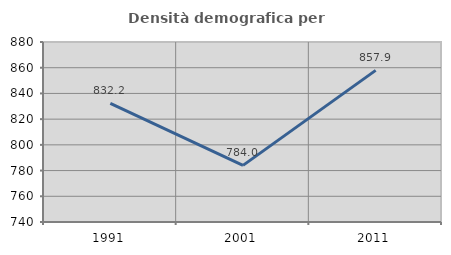
| Category | Densità demografica |
|---|---|
| 1991.0 | 832.196 |
| 2001.0 | 784.042 |
| 2011.0 | 857.942 |